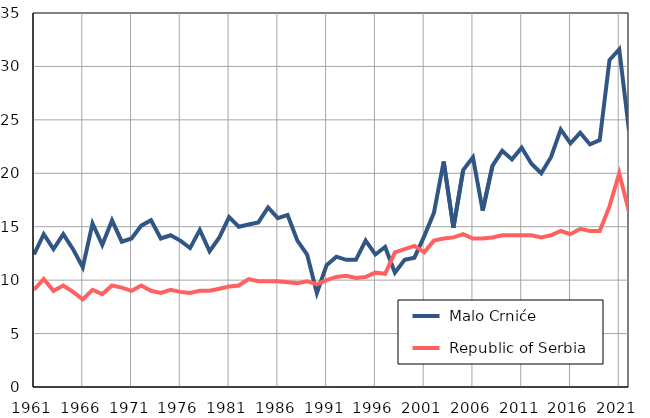
| Category |  Malo Crniće |  Republic of Serbia |
|---|---|---|
| 1961.0 | 12.4 | 9.1 |
| 1962.0 | 14.3 | 10.1 |
| 1963.0 | 12.9 | 9 |
| 1964.0 | 14.3 | 9.5 |
| 1965.0 | 12.9 | 8.9 |
| 1966.0 | 11.2 | 8.2 |
| 1967.0 | 15.3 | 9.1 |
| 1968.0 | 13.3 | 8.7 |
| 1969.0 | 15.6 | 9.5 |
| 1970.0 | 13.6 | 9.3 |
| 1971.0 | 13.9 | 9 |
| 1972.0 | 15.1 | 9.5 |
| 1973.0 | 15.6 | 9 |
| 1974.0 | 13.9 | 8.8 |
| 1975.0 | 14.2 | 9.1 |
| 1976.0 | 13.7 | 8.9 |
| 1977.0 | 13 | 8.8 |
| 1978.0 | 14.7 | 9 |
| 1979.0 | 12.7 | 9 |
| 1980.0 | 14 | 9.2 |
| 1981.0 | 15.9 | 9.4 |
| 1982.0 | 15 | 9.5 |
| 1983.0 | 15.2 | 10.1 |
| 1984.0 | 15.4 | 9.9 |
| 1985.0 | 16.8 | 9.9 |
| 1986.0 | 15.8 | 9.9 |
| 1987.0 | 16.1 | 9.8 |
| 1988.0 | 13.7 | 9.7 |
| 1989.0 | 12.4 | 9.9 |
| 1990.0 | 8.8 | 9.6 |
| 1991.0 | 11.4 | 10 |
| 1992.0 | 12.2 | 10.3 |
| 1993.0 | 11.9 | 10.4 |
| 1994.0 | 11.9 | 10.2 |
| 1995.0 | 13.7 | 10.3 |
| 1996.0 | 12.4 | 10.7 |
| 1997.0 | 13.1 | 10.6 |
| 1998.0 | 10.7 | 12.6 |
| 1999.0 | 11.9 | 12.9 |
| 2000.0 | 12.1 | 13.2 |
| 2001.0 | 14.1 | 12.6 |
| 2002.0 | 16.3 | 13.7 |
| 2003.0 | 21.1 | 13.9 |
| 2004.0 | 14.9 | 14 |
| 2005.0 | 20.3 | 14.3 |
| 2006.0 | 21.5 | 13.9 |
| 2007.0 | 16.5 | 13.9 |
| 2008.0 | 20.7 | 14 |
| 2009.0 | 22.1 | 14.2 |
| 2010.0 | 21.3 | 14.2 |
| 2011.0 | 22.4 | 14.2 |
| 2012.0 | 20.9 | 14.2 |
| 2013.0 | 20 | 14 |
| 2014.0 | 21.5 | 14.2 |
| 2015.0 | 24.1 | 14.6 |
| 2016.0 | 22.8 | 14.3 |
| 2017.0 | 23.8 | 14.8 |
| 2018.0 | 22.7 | 14.6 |
| 2019.0 | 23.1 | 14.6 |
| 2020.0 | 30.6 | 16.9 |
| 2021.0 | 31.6 | 20 |
| 2022.0 | 24 | 16.4 |